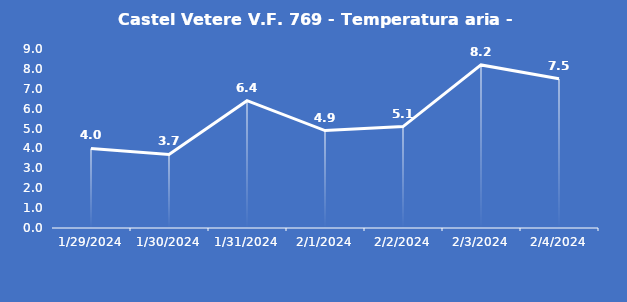
| Category | Castel Vetere V.F. 769 - Temperatura aria - Grezzo (°C) |
|---|---|
| 1/29/24 | 4 |
| 1/30/24 | 3.7 |
| 1/31/24 | 6.4 |
| 2/1/24 | 4.9 |
| 2/2/24 | 5.1 |
| 2/3/24 | 8.2 |
| 2/4/24 | 7.5 |